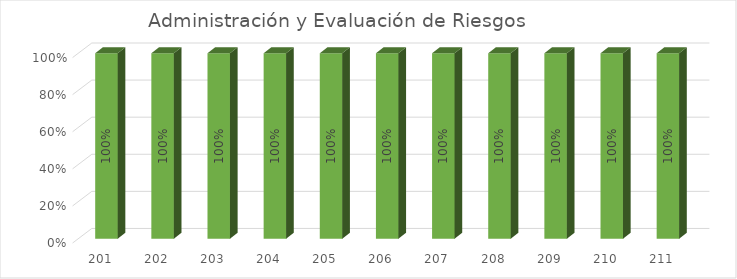
| Category | % Avance |
|---|---|
| 201.0 | 1 |
| 202.0 | 1 |
| 203.0 | 1 |
| 204.0 | 1 |
| 205.0 | 1 |
| 206.0 | 1 |
| 207.0 | 1 |
| 208.0 | 1 |
| 209.0 | 1 |
| 210.0 | 1 |
| 211.0 | 1 |